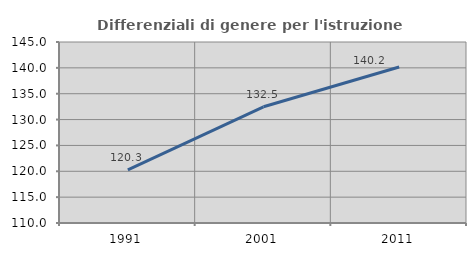
| Category | Differenziali di genere per l'istruzione superiore |
|---|---|
| 1991.0 | 120.261 |
| 2001.0 | 132.468 |
| 2011.0 | 140.162 |